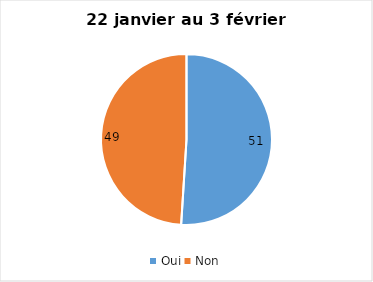
| Category | Series 0 |
|---|---|
| Oui | 51 |
| Non | 49 |